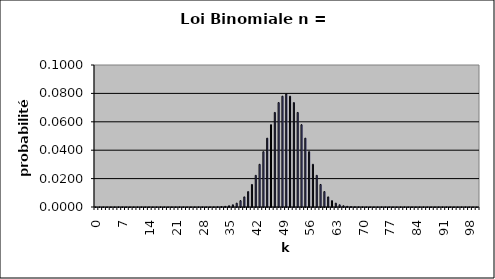
| Category | Series 0 |
|---|---|
| 0.0 | 0 |
| 1.0 | 0 |
| 2.0 | 0 |
| 3.0 | 0 |
| 4.0 | 0 |
| 5.0 | 0 |
| 6.0 | 0 |
| 7.0 | 0 |
| 8.0 | 0 |
| 9.0 | 0 |
| 10.0 | 0 |
| 11.0 | 0 |
| 12.0 | 0 |
| 13.0 | 0 |
| 14.0 | 0 |
| 15.0 | 0 |
| 16.0 | 0 |
| 17.0 | 0 |
| 18.0 | 0 |
| 19.0 | 0 |
| 20.0 | 0 |
| 21.0 | 0 |
| 22.0 | 0 |
| 23.0 | 0 |
| 24.0 | 0 |
| 25.0 | 0 |
| 26.0 | 0 |
| 27.0 | 0 |
| 28.0 | 0 |
| 29.0 | 0 |
| 30.0 | 0 |
| 31.0 | 0 |
| 32.0 | 0 |
| 33.0 | 0 |
| 34.0 | 0 |
| 35.0 | 0.001 |
| 36.0 | 0.002 |
| 37.0 | 0.003 |
| 38.0 | 0.004 |
| 39.0 | 0.007 |
| 40.0 | 0.011 |
| 41.0 | 0.016 |
| 42.0 | 0.022 |
| 43.0 | 0.03 |
| 44.0 | 0.039 |
| 45.0 | 0.048 |
| 46.0 | 0.058 |
| 47.0 | 0.067 |
| 48.0 | 0.074 |
| 49.0 | 0.078 |
| 50.0 | 0.08 |
| 51.0 | 0.078 |
| 52.0 | 0.074 |
| 53.0 | 0.067 |
| 54.0 | 0.058 |
| 55.0 | 0.048 |
| 56.0 | 0.039 |
| 57.0 | 0.03 |
| 58.0 | 0.022 |
| 59.0 | 0.016 |
| 60.0 | 0.011 |
| 61.0 | 0.007 |
| 62.0 | 0.004 |
| 63.0 | 0.003 |
| 64.0 | 0.002 |
| 65.0 | 0.001 |
| 66.0 | 0 |
| 67.0 | 0 |
| 68.0 | 0 |
| 69.0 | 0 |
| 70.0 | 0 |
| 71.0 | 0 |
| 72.0 | 0 |
| 73.0 | 0 |
| 74.0 | 0 |
| 75.0 | 0 |
| 76.0 | 0 |
| 77.0 | 0 |
| 78.0 | 0 |
| 79.0 | 0 |
| 80.0 | 0 |
| 81.0 | 0 |
| 82.0 | 0 |
| 83.0 | 0 |
| 84.0 | 0 |
| 85.0 | 0 |
| 86.0 | 0 |
| 87.0 | 0 |
| 88.0 | 0 |
| 89.0 | 0 |
| 90.0 | 0 |
| 91.0 | 0 |
| 92.0 | 0 |
| 93.0 | 0 |
| 94.0 | 0 |
| 95.0 | 0 |
| 96.0 | 0 |
| 97.0 | 0 |
| 98.0 | 0 |
| 99.0 | 0 |
| 100.0 | 0 |